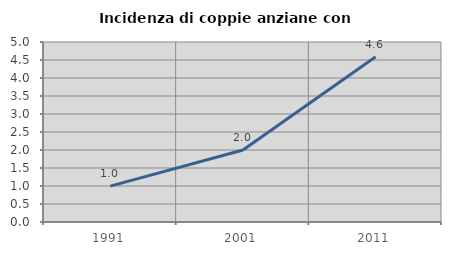
| Category | Incidenza di coppie anziane con figli |
|---|---|
| 1991.0 | 0.996 |
| 2001.0 | 2 |
| 2011.0 | 4.592 |